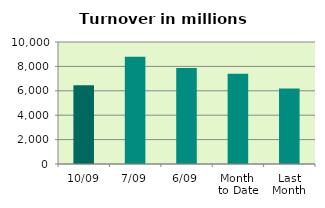
| Category | Series 0 |
|---|---|
| 10/09 | 6445.948 |
| 7/09 | 8796.022 |
| 6/09 | 7867.458 |
| Month 
to Date | 7388.15 |
| Last
Month | 6185.877 |